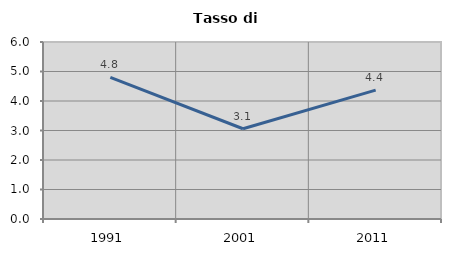
| Category | Tasso di disoccupazione   |
|---|---|
| 1991.0 | 4.804 |
| 2001.0 | 3.06 |
| 2011.0 | 4.367 |